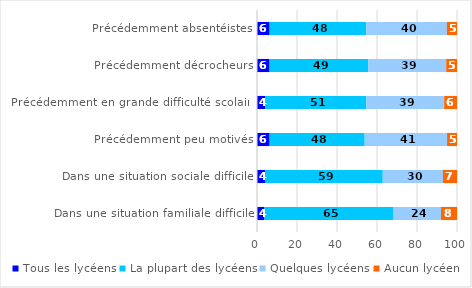
| Category | Tous les lycéens | La plupart des lycéens | Quelques lycéens | Aucun lycéen |
|---|---|---|---|---|
| Précédemment absentéistes | 6.327 | 48.271 | 40.336 | 5.066 |
| Précédemment décrocheurs | 6.297 | 49.384 | 38.945 | 5.373 |
| Précédemment en grande difficulté scolaire | 4.091 | 50.603 | 38.905 | 6.401 |
| Précédemment peu motivés | 6.323 | 47.522 | 41.18 | 4.975 |
| Dans une situation sociale difficile | 3.983 | 58.894 | 30.106 | 7.016 |
| Dans une situation familiale difficile | 3.507 | 64.803 | 23.692 | 7.998 |